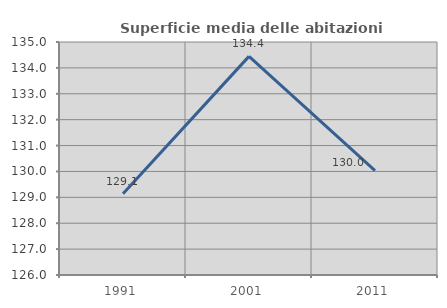
| Category | Superficie media delle abitazioni occupate |
|---|---|
| 1991.0 | 129.14 |
| 2001.0 | 134.445 |
| 2011.0 | 130.029 |